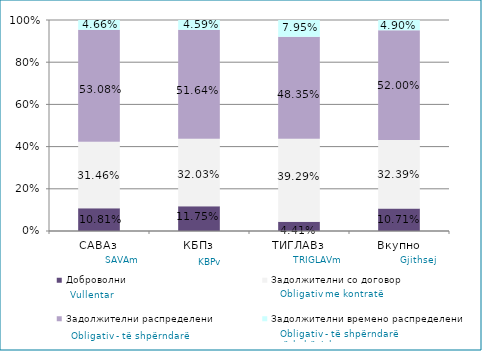
| Category | Доброволни  | Задолжителни со договор  | Задолжителни распределени  | Задолжителни времено распределени  |
|---|---|---|---|---|
| САВАз | 0.108 | 0.315 | 0.531 | 0.047 |
| КБПз | 0.117 | 0.32 | 0.516 | 0.046 |
| ТИГЛАВз | 0.044 | 0.393 | 0.483 | 0.08 |
| Вкупно | 0.107 | 0.324 | 0.52 | 0.049 |